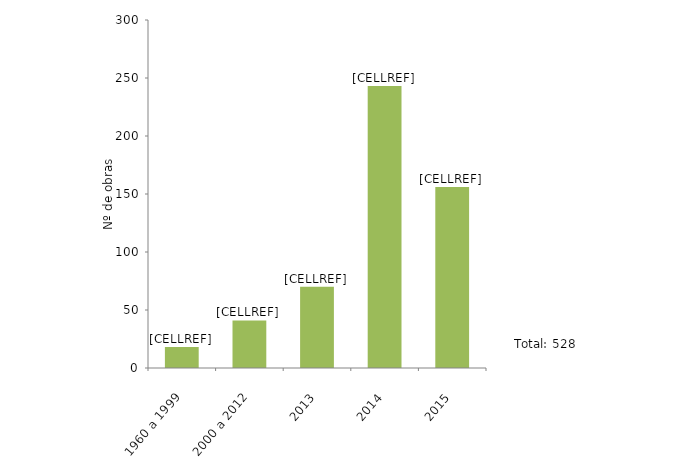
| Category | Series 0 |
|---|---|
| 1960 a 1999 | 18 |
| 2000 a 2012 | 41 |
| 2013 | 70 |
| 2014 | 243 |
| 2015 | 156 |